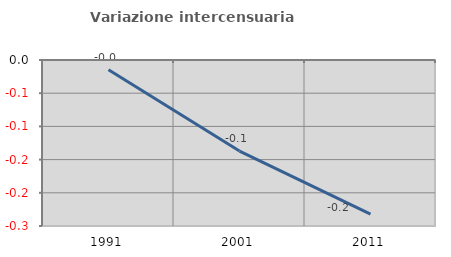
| Category | Variazione intercensuaria annua |
|---|---|
| 1991.0 | -0.015 |
| 2001.0 | -0.137 |
| 2011.0 | -0.232 |